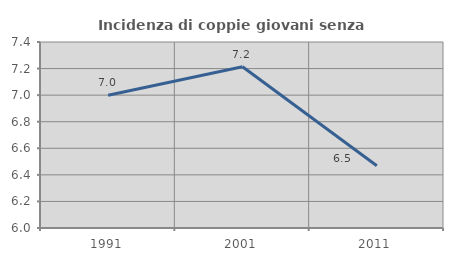
| Category | Incidenza di coppie giovani senza figli |
|---|---|
| 1991.0 | 6.999 |
| 2001.0 | 7.214 |
| 2011.0 | 6.469 |